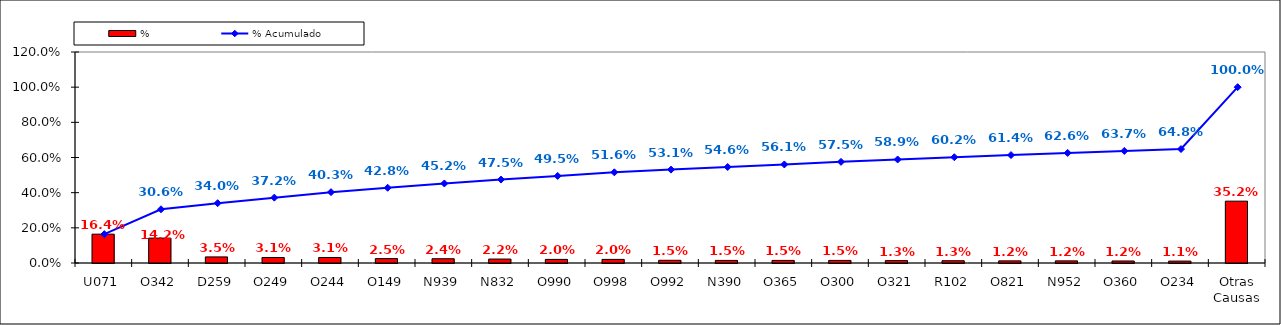
| Category | % |
|---|---|
| U071 | 0.164 |
| O342 | 0.142 |
| D259 | 0.035 |
| O249 | 0.031 |
| O244 | 0.031 |
| O149 | 0.025 |
| N939 | 0.024 |
| N832 | 0.022 |
| O990 | 0.02 |
| O998 | 0.02 |
| O992 | 0.015 |
| N390 | 0.015 |
| O365 | 0.015 |
| O300 | 0.015 |
| O321 | 0.013 |
| R102 | 0.013 |
| O821 | 0.012 |
| N952 | 0.012 |
| O360 | 0.012 |
| O234 | 0.011 |
| Otras Causas | 0.352 |